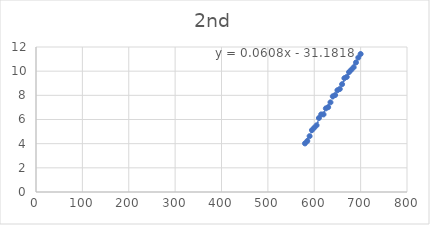
| Category | Series 0 |
|---|---|
| 580.0 | 4.02 |
| 585.0 | 4.22 |
| 590.0 | 4.62 |
| 595.0 | 5.12 |
| 600.0 | 5.32 |
| 605.0 | 5.52 |
| 610.0 | 6.12 |
| 615.0 | 6.42 |
| 620.0 | 6.42 |
| 625.0 | 6.92 |
| 630.0 | 7.02 |
| 635.0 | 7.42 |
| 640.0 | 7.92 |
| 645.0 | 8.02 |
| 650.0 | 8.42 |
| 655.0 | 8.52 |
| 660.0 | 8.92 |
| 665.0 | 9.42 |
| 670.0 | 9.52 |
| 675.0 | 9.92 |
| 680.0 | 10.12 |
| 685.0 | 10.32 |
| 690.0 | 10.72 |
| 695.0 | 11.12 |
| 700.0 | 11.42 |